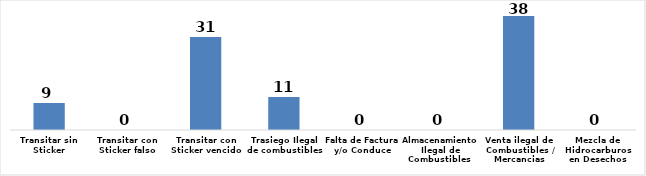
| Category | Series 0 |
|---|---|
| Transitar sin Sticker | 9 |
| Transitar con Sticker falso | 0 |
| Transitar con Sticker vencido | 31 |
| Trasiego Ilegal de combustibles  | 11 |
| Falta de Factura y/o Conduce | 0 |
| Almacenamiento Ilegal de Combustibles  | 0 |
| Venta ilegal de Combustibles / Mercancias | 38 |
| Mezcla de Hidrocarburos en Desechos | 0 |